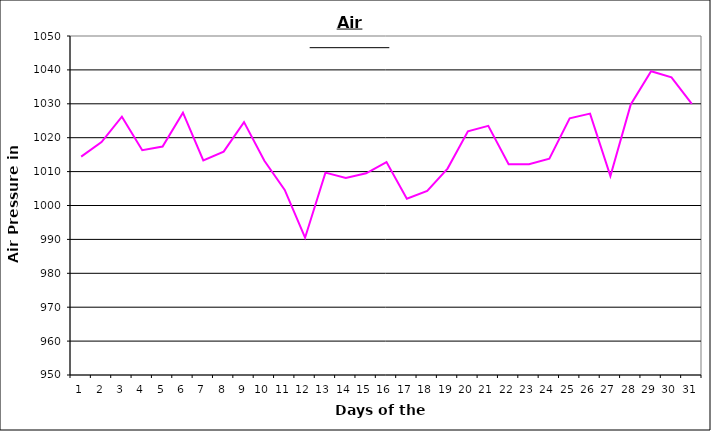
| Category | Series 0 |
|---|---|
| 0 | 1014.4 |
| 1 | 1018.7 |
| 2 | 1026.2 |
| 3 | 1016.3 |
| 4 | 1017.4 |
| 5 | 1027.4 |
| 6 | 1013.3 |
| 7 | 1015.9 |
| 8 | 1024.6 |
| 9 | 1013.2 |
| 10 | 1004.6 |
| 11 | 990.5 |
| 12 | 1009.7 |
| 13 | 1008.1 |
| 14 | 1009.5 |
| 15 | 1012.8 |
| 16 | 1002 |
| 17 | 1004.3 |
| 18 | 1010.9 |
| 19 | 1021.9 |
| 20 | 1023.5 |
| 21 | 1012.2 |
| 22 | 1012.2 |
| 23 | 1013.8 |
| 24 | 1025.7 |
| 25 | 1027.1 |
| 26 | 1008.7 |
| 27 | 1029.8 |
| 28 | 1039.6 |
| 29 | 1037.8 |
| 30 | 1030 |